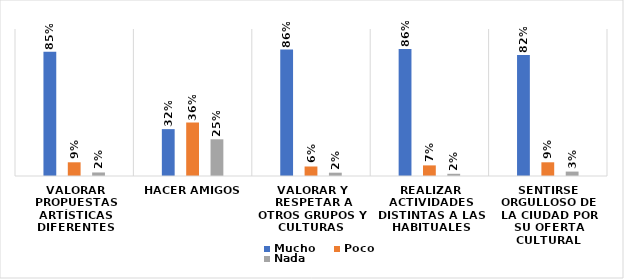
| Category | Mucho | Poco | Nada |
|---|---|---|---|
| Valorar propuestas artísticas diferentes | 0.845 | 0.093 | 0.024 |
| Hacer amigos | 0.319 | 0.364 | 0.25 |
| Valorar y respetar a otros grupos y culturas  | 0.86 | 0.065 | 0.023 |
| Realizar actividades distintas a las habituales | 0.865 | 0.072 | 0.015 |
| Sentirse orgulloso de la ciudad por su oferta cultural | 0.823 | 0.093 | 0.03 |